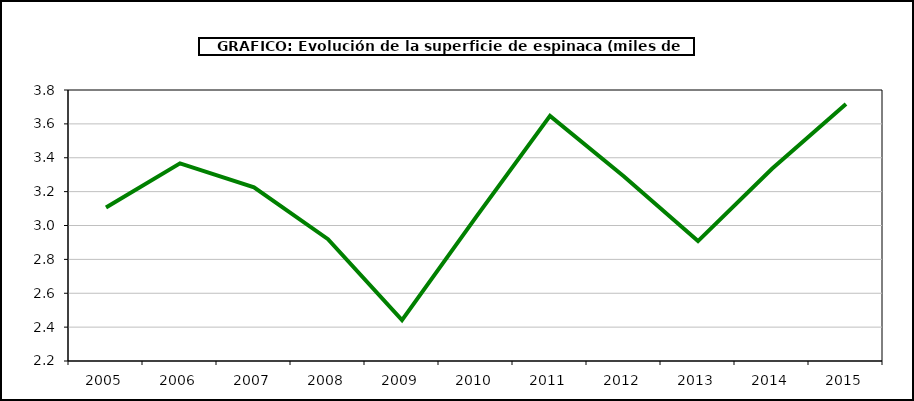
| Category | superficie |
|---|---|
| 2005.0 | 3.106 |
| 2006.0 | 3.367 |
| 2007.0 | 3.225 |
| 2008.0 | 2.919 |
| 2009.0 | 2.441 |
| 2010.0 | 3.049 |
| 2011.0 | 3.647 |
| 2012.0 | 3.289 |
| 2013.0 | 2.908 |
| 2014.0 | 3.335 |
| 2015.0 | 3.717 |